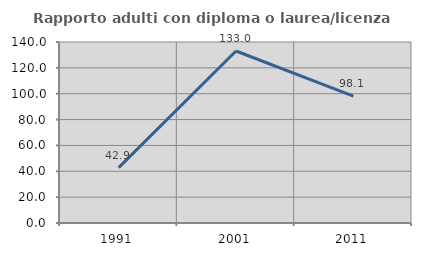
| Category | Rapporto adulti con diploma o laurea/licenza media  |
|---|---|
| 1991.0 | 42.857 |
| 2001.0 | 133.043 |
| 2011.0 | 98.065 |